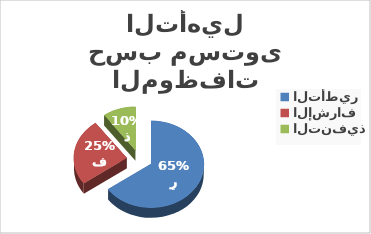
| Category | إناث |
|---|---|
| التأطير | 401 |
| الإشراف | 153 |
| التنفيذ | 62 |